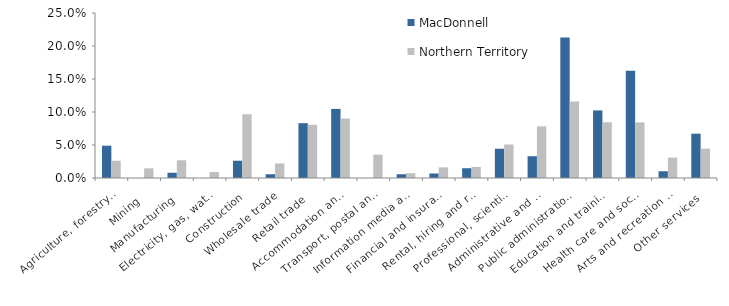
| Category | MacDonnell | Northern Territory |
|---|---|---|
| Agriculture, forestry and fishing | 0.049 | 0.026 |
| Mining | 0 | 0.015 |
| Manufacturing | 0.008 | 0.027 |
| Electricity, gas, water and waste services | 0 | 0.009 |
| Construction | 0.026 | 0.097 |
| Wholesale trade | 0.006 | 0.022 |
| Retail trade | 0.083 | 0.081 |
| Accommodation and food services | 0.105 | 0.09 |
| Transport, postal and warehousing | 0 | 0.035 |
| Information media and telecommunications | 0.006 | 0.007 |
| Financial and insurance services | 0.007 | 0.016 |
| Rental, hiring and real estate services | 0.015 | 0.017 |
| Professional, scientific and technical services | 0.044 | 0.051 |
| Administrative and support services | 0.033 | 0.078 |
| Public administration and safety | 0.213 | 0.116 |
| Education and training | 0.102 | 0.084 |
| Health care and social assistance | 0.163 | 0.084 |
| Arts and recreation services | 0.01 | 0.031 |
| Other services | 0.067 | 0.045 |